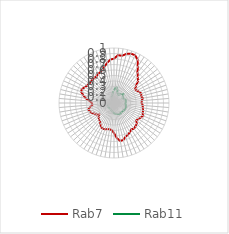
| Category | Rab7 | Rab11 |
|---|---|---|
| 0.0 | 0.805 | 0.228 |
| 0.10913 | 0.873 | 0.27 |
| 0.21825 | 0.87 | 0.283 |
| 0.32738 | 0.921 | 0.251 |
| 0.43651 | 0.949 | 0.188 |
| 0.54563 | 0.95 | 0.177 |
| 0.65476 | 0.9 | 0.167 |
| 0.76389 | 0.789 | 0.182 |
| 0.87302 | 0.697 | 0.21 |
| 0.98214 | 0.638 | 0.207 |
| 1.09127 | 0.593 | 0.234 |
| 1.2004 | 0.508 | 0.205 |
| 1.30952 | 0.456 | 0.189 |
| 1.41865 | 0.471 | 0.178 |
| 1.52778 | 0.502 | 0.198 |
| 1.6369 | 0.526 | 0.206 |
| 1.74603 | 0.508 | 0.219 |
| 1.85516 | 0.533 | 0.225 |
| 1.96429 | 0.505 | 0.215 |
| 2.07341 | 0.501 | 0.215 |
| 2.18254 | 0.526 | 0.204 |
| 2.29167 | 0.531 | 0.219 |
| 2.40079 | 0.547 | 0.222 |
| 2.50992 | 0.55 | 0.229 |
| 2.61905 | 0.576 | 0.236 |
| 2.72817 | 0.554 | 0.227 |
| 2.8373 | 0.533 | 0.223 |
| 2.94643 | 0.513 | 0.218 |
| 3.05556 | 0.563 | 0.221 |
| 3.16468 | 0.573 | 0.219 |
| 3.27381 | 0.593 | 0.216 |
| 3.38294 | 0.572 | 0.22 |
| 3.49206 | 0.606 | 0.223 |
| 3.60119 | 0.63 | 0.224 |
| 3.71032 | 0.647 | 0.214 |
| 3.81944 | 0.693 | 0.2 |
| 3.92857 | 0.7 | 0.203 |
| 4.0377 | 0.642 | 0.194 |
| 4.14683 | 0.546 | 0.192 |
| 4.25595 | 0.495 | 0.174 |
| 4.36508 | 0.483 | 0.164 |
| 4.47421 | 0.489 | 0.146 |
| 4.58333 | 0.505 | 0.143 |
| 4.69246 | 0.511 | 0.138 |
| 4.80159 | 0.493 | 0.137 |
| 4.91071 | 0.455 | 0.118 |
| 5.01984 | 0.419 | 0.112 |
| 5.12897 | 0.404 | 0.115 |
| 5.2381 | 0.379 | 0.124 |
| 5.34722 | 0.341 | 0.122 |
| 5.45635 | 0.383 | 0.124 |
| 5.56548 | 0.405 | 0.128 |
| 5.6746 | 0.451 | 0.124 |
| 5.78373 | 0.462 | 0.132 |
| 5.89286 | 0.482 | 0.11 |
| 6.00198 | 0.438 | 0.092 |
| 6.11111 | 0.392 | 0.06 |
| 6.22024 | 0.404 | 0.04 |
| 6.32937 | 0.44 | 0.037 |
| 6.43849 | 0.522 | 0.03 |
| 6.54762 | 0.576 | 0.032 |
| 6.65675 | 0.633 | 0.018 |
| 6.76587 | 0.636 | 0.013 |
| 6.875 | 0.603 | 0.017 |
| 6.98413 | 0.579 | 0.016 |
| 7.09325 | 0.571 | 0.023 |
| 7.20238 | 0.57 | 0.03 |
| 7.31151 | 0.58 | 0.034 |
| 7.42063 | 0.577 | 0.049 |
| 7.52976 | 0.58 | 0.059 |
| 7.63889 | 0.602 | 0.081 |
| 7.74802 | 0.616 | 0.103 |
| 7.85714 | 0.642 | 0.116 |
| 7.96627 | 0.69 | 0.136 |
| 8.0754 | 0.741 | 0.159 |
| 8.18452 | 0.793 | 0.214 |